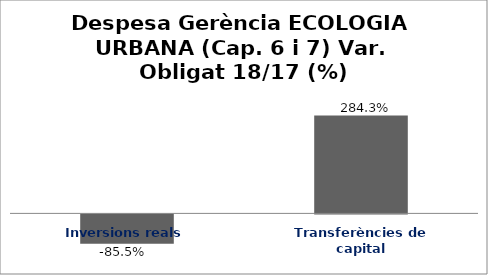
| Category | Series 0 |
|---|---|
| Inversions reals | -0.855 |
| Transferències de capital | 2.843 |